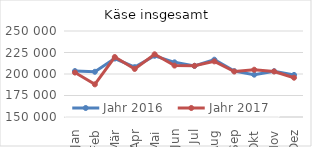
| Category | Jahr 2016 | Jahr 2017 |
|---|---|---|
| Jan | 203423.678 | 201665.112 |
| Feb | 202571.365 | 187960.039 |
| Mär | 217945.305 | 219723.909 |
| Apr | 208001.971 | 205878.498 |
| Mai | 221198.397 | 222908.497 |
| Jun | 213571.428 | 209797.336 |
| Jul | 209455.565 | 209522.812 |
| Aug | 216644.369 | 214676.416 |
| Sep | 203315.178 | 202891.62 |
| Okt | 199219.89 | 204974.492 |
| Nov | 203258.616 | 202965.342 |
| Dez | 198933.247 | 195687.118 |